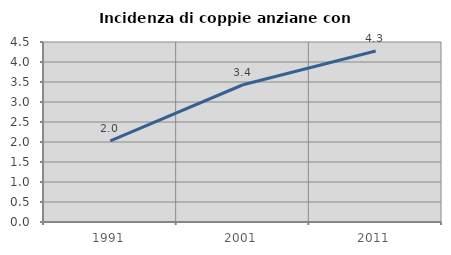
| Category | Incidenza di coppie anziane con figli |
|---|---|
| 1991.0 | 2.03 |
| 2001.0 | 3.431 |
| 2011.0 | 4.274 |